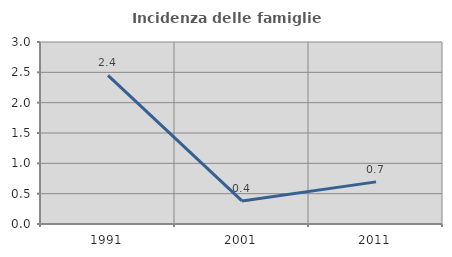
| Category | Incidenza delle famiglie numerose |
|---|---|
| 1991.0 | 2.449 |
| 2001.0 | 0.38 |
| 2011.0 | 0.694 |